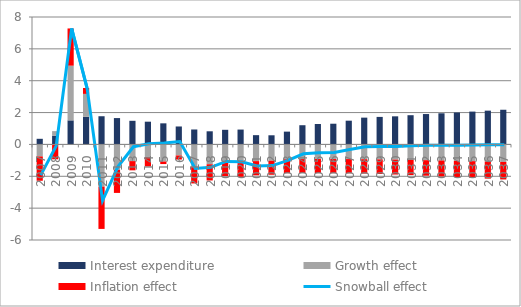
| Category | Interest expenditure | Growth effect | Inflation effect |
|---|---|---|---|
| 0 | 0.353 | -0.754 | -1.527 |
| 1 | 0.551 | 0.285 | -0.933 |
| 2 | 1.511 | 3.434 | 2.337 |
| 3 | 1.731 | 1.442 | 0.368 |
| 4 | 1.77 | -2.65 | -2.655 |
| 5 | 1.655 | -1.594 | -1.45 |
| 6 | 1.483 | -1.047 | -0.579 |
| 7 | 1.428 | -0.798 | -0.585 |
| 8 | 1.324 | -1.075 | -0.157 |
| 9 | 1.127 | -0.694 | -0.255 |
| 10 | 0.938 | -1.39 | -1.06 |
| 11 | 0.825 | -1.245 | -1.018 |
| 12 | 0.918 | -1.135 | -0.853 |
| 13 | 0.933 | -1.17 | -0.858 |
| 14 | 0.582 | -1.048 | -0.89 |
| 15 | 0.574 | -1.024 | -0.88 |
| 16 | 0.804 | -0.931 | -0.874 |
| 17 | 1.206 | -0.92 | -0.874 |
| 18 | 1.281 | -0.917 | -0.884 |
| 19 | 1.3 | -0.917 | -0.887 |
| 20 | 1.491 | -0.919 | -0.892 |
| 21 | 1.682 | -0.927 | -0.902 |
| 22 | 1.728 | -0.94 | -0.918 |
| 23 | 1.764 | -0.955 | -0.935 |
| 24 | 1.835 | -0.971 | -0.953 |
| 25 | 1.908 | -0.989 | -0.974 |
| 26 | 1.956 | -1.008 | -0.996 |
| 27 | 2.004 | -1.029 | -1.02 |
| 28 | 2.061 | -1.052 | -1.045 |
| 29 | 2.121 | -1.075 | -1.072 |
| 30 | 2.177 | -1.1 | -1.1 |